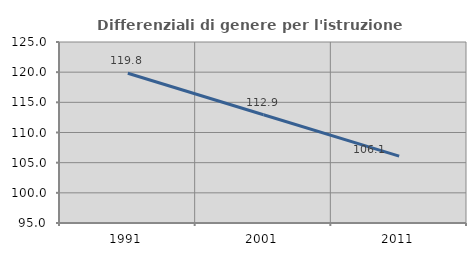
| Category | Differenziali di genere per l'istruzione superiore |
|---|---|
| 1991.0 | 119.825 |
| 2001.0 | 112.936 |
| 2011.0 | 106.088 |